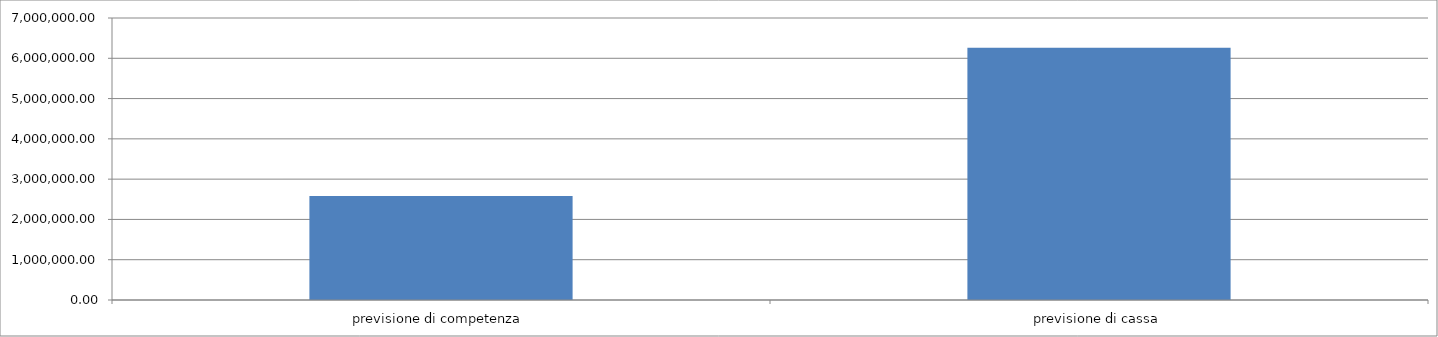
| Category | Series 0 |
|---|---|
| previsione di competenza | 2582000 |
| previsione di cassa | 6262000 |